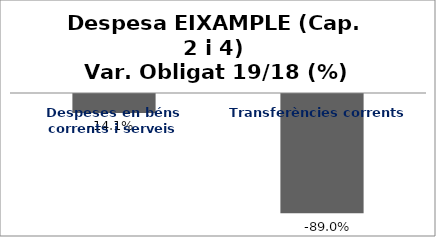
| Category | Series 0 |
|---|---|
| Despeses en béns corrents i serveis | -0.141 |
| Transferències corrents | -0.89 |